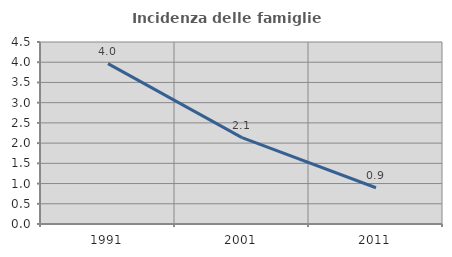
| Category | Incidenza delle famiglie numerose |
|---|---|
| 1991.0 | 3.964 |
| 2001.0 | 2.135 |
| 2011.0 | 0.897 |